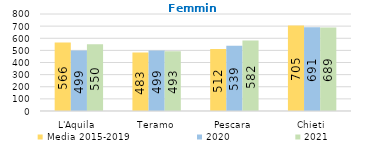
| Category | Media 2015-2019  | 2020 | 2021 |
|---|---|---|---|
| L'Aquila | 565.8 | 499 | 550 |
| Teramo | 482.8 | 499 | 493 |
| Pescara | 511.8 | 539 | 582 |
| Chieti | 705 | 691 | 689 |